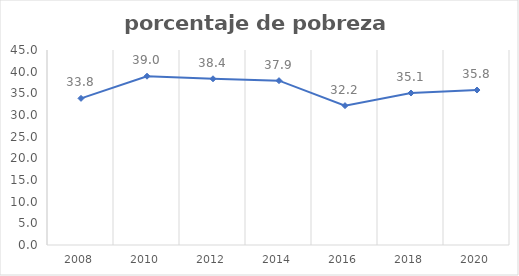
| Category | Series 0 |
|---|---|
| 2008.0 | 33.841 |
| 2010.0 | 38.951 |
| 2012.0 | 38.359 |
| 2014.0 | 37.924 |
| 2016.0 | 32.162 |
| 2018.0 | 35.07 |
| 2020.0 | 35.766 |